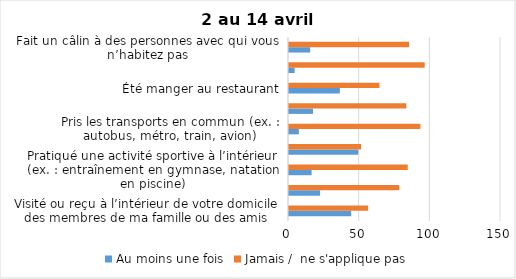
| Category | Au moins une fois | Jamais /  ne s'applique pas |
|---|---|---|
| Visité ou reçu à l’intérieur de votre domicile des membres de ma famille ou des amis | 44 | 56 |
| Visité ou pris soin de vos proches âgés de 70 ans ou plus | 22 | 78 |
| Pratiqué une activité sportive à l’intérieur (ex. : entraînement en gymnase, natation en piscine) | 16 | 84 |
| Pratiqué une activité sportive à l’extérieur (ex. : course à pied, ski) | 49 | 51 |
| Pris les transports en commun (ex. : autobus, métro, train, avion) | 7 | 93 |
| Été dans une autre région du Québec (ex. : j’ai été à mon chalet) | 17 | 83 |
| Été manger au restaurant | 36 | 64 |
| Été au cinéma | 4 | 96 |
| Fait un câlin à des personnes avec qui vous n’habitez pas | 15 | 85 |